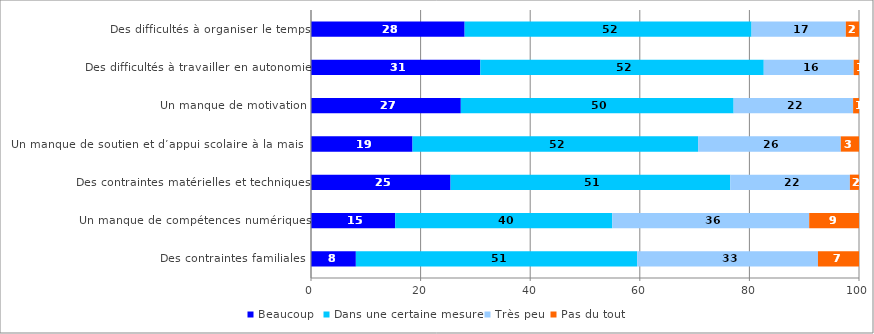
| Category | Beaucoup  | Dans une certaine mesure | Très peu | Pas du tout |
|---|---|---|---|---|
| Des difficultés à organiser le temps | 28.036 | 52.36 | 17.202 | 2.402 |
| Des difficultés à travailler en autonomie | 30.896 | 51.726 | 16.405 | 0.973 |
| Un manque de motivation | 27.339 | 49.785 | 21.801 | 1.075 |
| Un manque de soutien et d’appui scolaire à la maison | 18.529 | 52.108 | 26.042 | 3.321 |
| Des contraintes matérielles et techniques | 25.468 | 51.042 | 21.828 | 1.661 |
| Un manque de compétences numériques | 15.354 | 39.631 | 35.928 | 9.087 |
| Des contraintes familiales | 8.185 | 51.334 | 32.99 | 7.49 |